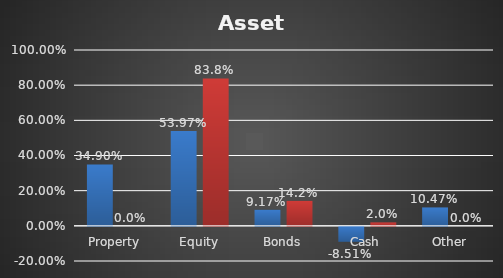
| Category | Series 0 | Series 1 |
|---|---|---|
| Property | 0.349 | 0 |
| Equity | 0.54 | 0.838 |
| Bonds | 0.092 | 0.142 |
| Cash | -0.085 | 0.02 |
| Other | 0.105 | 0 |